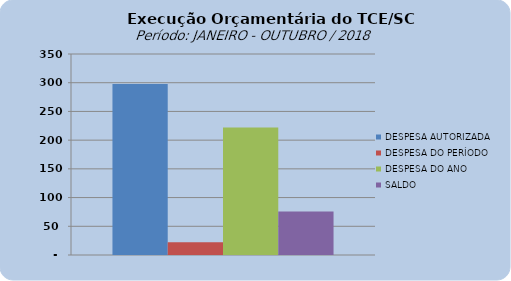
| Category | DESPESA AUTORIZADA | DESPESA DO PERÍODO | DESPESA DO ANO | SALDO |
|---|---|---|---|---|
| 0 | 297624065.21 | 22413963.85 | 221983837.03 | 75640228.18 |